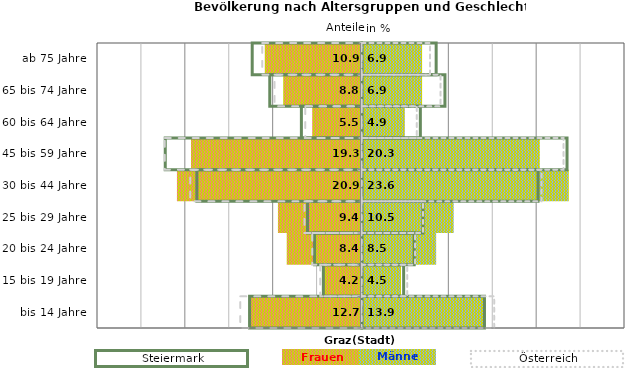
| Category | Frauen | Männer | Frauen Spalte2 | Männer Spalte2 | Frauen Spalte3 | Männer Spalte3 |
|---|---|---|---|---|---|---|
| bis 14 Jahre | -12.7 | 13.9 | 14 | -12.8 | -13.8 | 15.1 |
| 15 bis 19 Jahre | -4.2 | 4.5 | 4.8 | -4.4 | -4.7 | 5.2 |
| 20 bis 24 Jahre | -8.4 | 8.5 | 6 | -5.4 | -5.6 | 6.1 |
| 25 bis 29 Jahre | -9.4 | 10.5 | 7 | -6.2 | -6.5 | 7 |
| 30 bis 44 Jahre | -20.9 | 23.6 | 20.1 | -18.8 | -19.5 | 20.5 |
| 45 bis 59 Jahre | -19.3 | 20.3 | 23.4 | -22.4 | -22.4 | 23 |
| 60 bis 64 Jahre | -5.5 | 4.9 | 6.7 | -6.9 | -6.4 | 6.3 |
| 65 bis 74 Jahre | -8.8 | 6.9 | 9.5 | -10.5 | -9.9 | 9 |
| ab 75 Jahre | -10.9 | 6.9 | 8.5 | -12.5 | -11.3 | 7.8 |